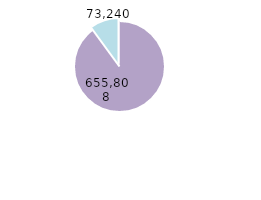
| Category | Series 0 |
|---|---|
| Mujeres | 655808 |
| Hombres | 73240 |